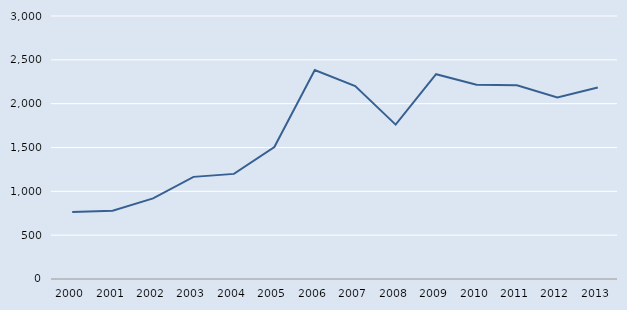
| Category | Series 0 |
|---|---|
| 2000.0 | 765 |
| 2001.0 | 779 |
| 2002.0 | 920 |
| 2003.0 | 1165 |
| 2004.0 | 1199 |
| 2005.0 | 1505 |
| 2006.0 | 2383 |
| 2007.0 | 2201 |
| 2008.0 | 1761 |
| 2009.0 | 2336 |
| 2010.0 | 2217 |
| 2011.0 | 2211 |
| 2012.0 | 2071 |
| 2013.0 | 2184 |